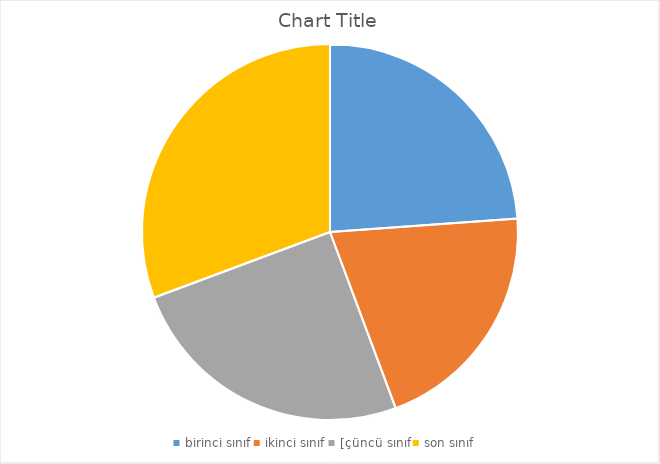
| Category | Series 0 |
|---|---|
| birinci sınıf | 21 |
| ikinci sınıf | 18 |
| [çüncü sınıf | 22 |
| son sınıf | 27 |